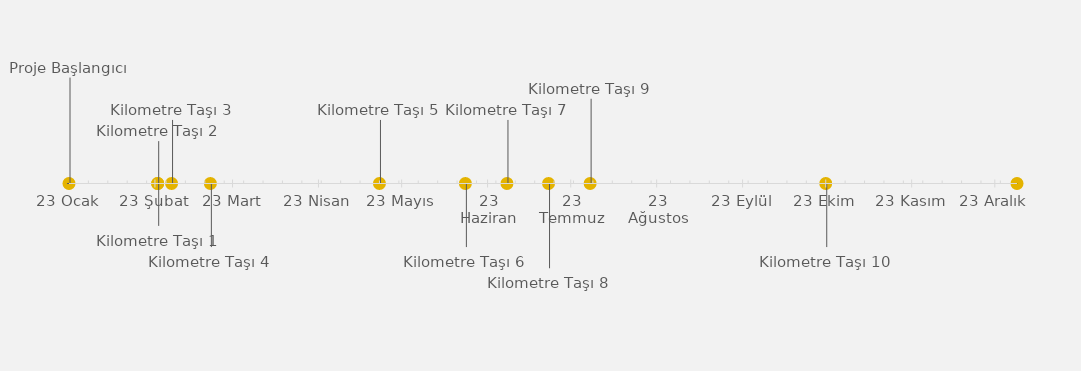
| Category | KONUM |
|---|---|
| Proje Başlangıcı | 25 |
| Kilometre Taşı 1 | -10 |
| Kilometre Taşı 2 | 10 |
| Kilometre Taşı 3 | 15 |
| Kilometre Taşı 4 | -15 |
| Kilometre Taşı 5 | 15 |
| Kilometre Taşı 6 | -15 |
| Kilometre Taşı 7 | 15 |
| Kilometre Taşı 8 | -20 |
| Kilometre Taşı 9 | 20 |
| Kilometre Taşı 10 | -15 |
| Proje Sonu | 15 |